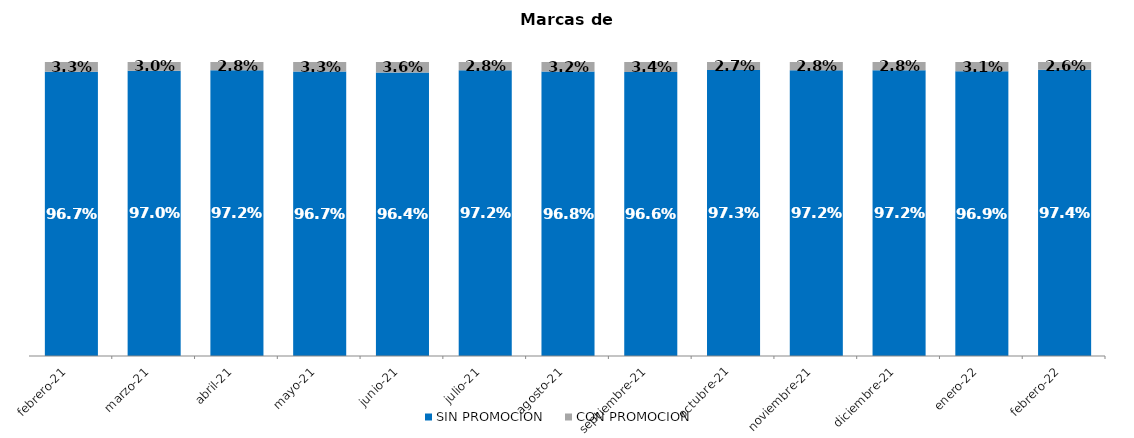
| Category | SIN PROMOCION   | CON PROMOCION   |
|---|---|---|
| 2021-02-01 | 0.967 | 0.033 |
| 2021-03-01 | 0.97 | 0.03 |
| 2021-04-01 | 0.972 | 0.028 |
| 2021-05-01 | 0.967 | 0.033 |
| 2021-06-01 | 0.964 | 0.036 |
| 2021-07-01 | 0.972 | 0.028 |
| 2021-08-01 | 0.968 | 0.032 |
| 2021-09-01 | 0.966 | 0.034 |
| 2021-10-01 | 0.973 | 0.027 |
| 2021-11-01 | 0.972 | 0.028 |
| 2021-12-01 | 0.972 | 0.028 |
| 2022-01-01 | 0.969 | 0.031 |
| 2022-02-01 | 0.974 | 0.026 |